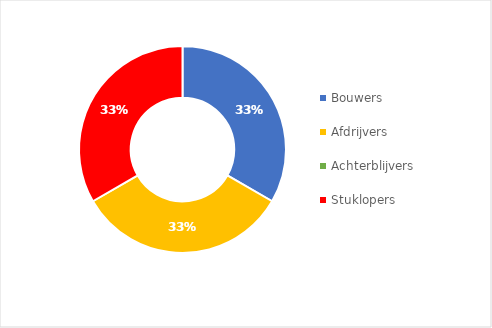
| Category | Series 0 |
|---|---|
| Bouwers | 0.333 |
| Afdrijvers | 0.333 |
| Achterblijvers | 0 |
| Stuklopers | 0.333 |